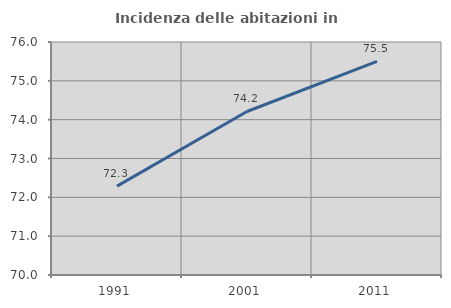
| Category | Incidenza delle abitazioni in proprietà  |
|---|---|
| 1991.0 | 72.288 |
| 2001.0 | 74.211 |
| 2011.0 | 75.501 |